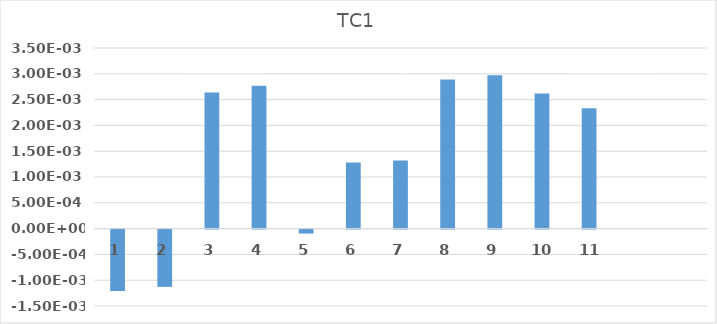
| Category | TC1 |
|---|---|
| 1.0 | -0.001 |
| 2.0 | -0.001 |
| 3.0 | 0.003 |
| 4.0 | 0.003 |
| 5.0 | 0 |
| 6.0 | 0.001 |
| 7.0 | 0.001 |
| 8.0 | 0.003 |
| 9.0 | 0.003 |
| 10.0 | 0.003 |
| 11.0 | 0.002 |